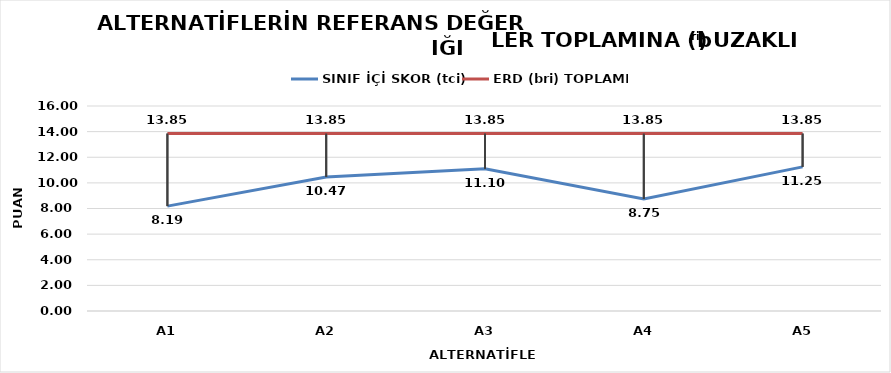
| Category | SINIF İÇİ SKOR (tci) | ERD (bri) TOPLAMI |
|---|---|---|
| A1 | 8.186 | 13.85 |
| A2 | 10.466 | 13.85 |
| A3 | 11.104 | 13.85 |
| A4 | 8.748 | 13.85 |
| A5 | 11.249 | 13.85 |